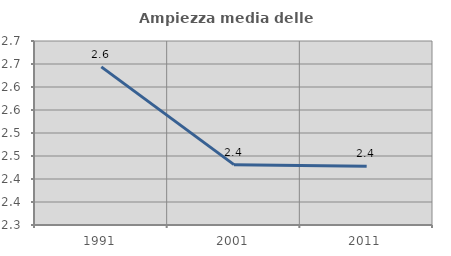
| Category | Ampiezza media delle famiglie |
|---|---|
| 1991.0 | 2.644 |
| 2001.0 | 2.431 |
| 2011.0 | 2.428 |